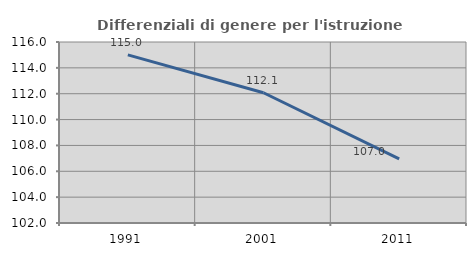
| Category | Differenziali di genere per l'istruzione superiore |
|---|---|
| 1991.0 | 115.006 |
| 2001.0 | 112.073 |
| 2011.0 | 106.953 |